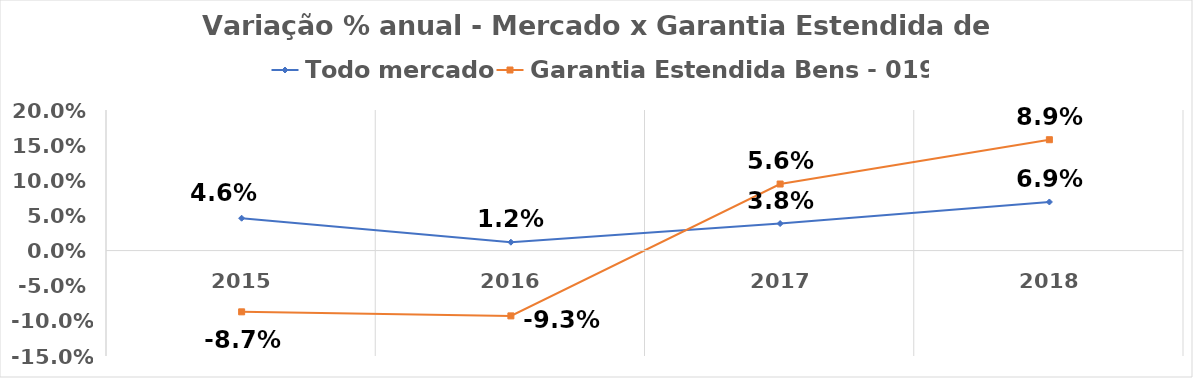
| Category | Todo mercado | Garantia Estendida Bens - 0195 |
|---|---|---|
| 2015.0 | 0.046 | -0.087 |
| 2016.0 | 0.012 | -0.093 |
| 2017.0 | 0.038 | 0.056 |
| 2018.0 | 0.069 | 0.089 |